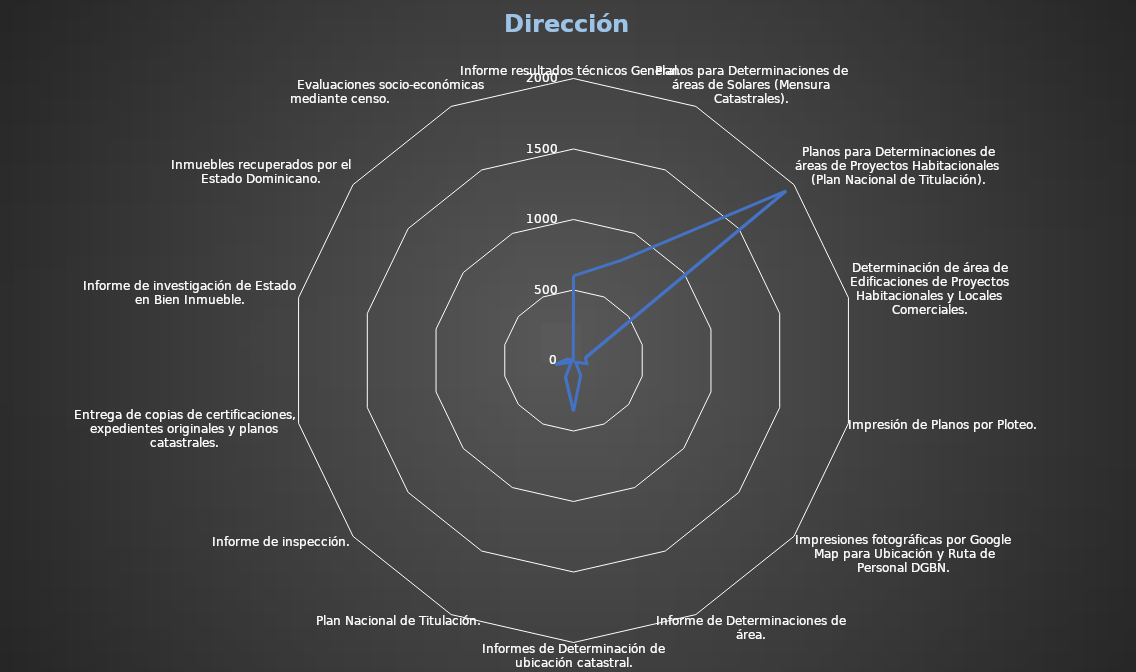
| Category | Series 0 |
|---|---|
| Informe resultados técnicos General. | 600 |
| Planos para Determinaciones de áreas de Solares (Mensura Catastrales). | 790 |
| Planos para Determinaciones de áreas de Proyectos Habitacionales (Plan Nacional de Titulación). | 1929 |
| Determinación de área de Edificaciones de Proyectos Habitacionales y Locales Comerciales. | 87 |
| Impresión de Planos por Ploteo. | 97 |
| Impresiones fotográficas por Google Map para Ubicación y Ruta de Personal DGBN. | 19 |
| Informe de Determinaciones de área. | 118 |
| Informes de Determinación de ubicación catastral. | 360 |
| Plan Nacional de Titulación. | 131 |
| Informe de inspección. | 19 |
| Entrega de copias de certificaciones, expedientes originales y planos catastrales. | 131 |
| Informe de investigación de Estado en Bien Inmueble. | 44 |
| Inmuebles recuperados por el Estado Dominicano. | 2 |
| Evaluaciones socio-económicas mediante censo.                            | 7 |